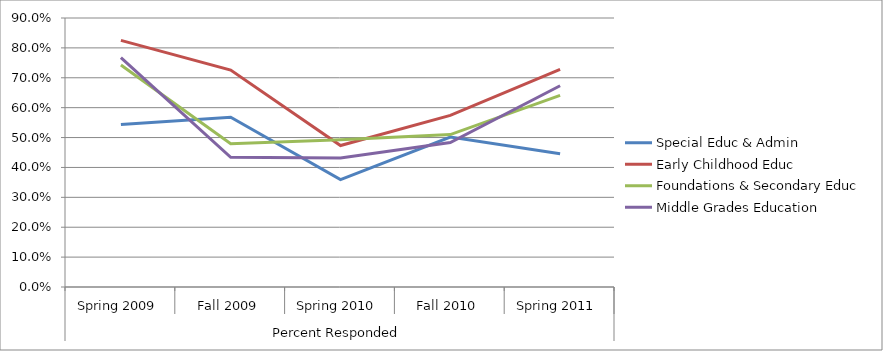
| Category | Special Educ & Admin | Early Childhood Educ | Foundations & Secondary Educ | Middle Grades Education |
|---|---|---|---|---|
| 0 | 0.543 | 0.825 | 0.743 | 0.767 |
| 1 | 0.568 | 0.726 | 0.479 | 0.434 |
| 2 | 0.359 | 0.473 | 0.493 | 0.432 |
| 3 | 0.502 | 0.574 | 0.51 | 0.483 |
| 4 | 0.446 | 0.728 | 0.641 | 0.673 |